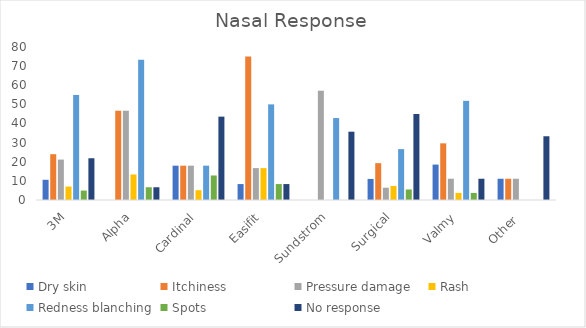
| Category | Dry skin | Itchiness | Pressure damage | Rash  | Redness blanching | Spots | No response |
|---|---|---|---|---|---|---|---|
| 3M | 10.563 | 23.944 | 21.127 | 7.042 | 54.93 | 4.93 | 21.831 |
| Alpha | 0 | 46.667 | 46.667 | 13.333 | 73.333 | 6.667 | 6.667 |
| Cardinal | 17.949 | 17.949 | 17.949 | 5.128 | 17.949 | 12.821 | 43.59 |
| Easifit | 8.333 | 75 | 16.667 | 16.667 | 50 | 8.333 | 8.333 |
| Sundstrom | 0 | 0 | 57.143 | 0 | 42.857 | 0 | 35.714 |
| Surgical | 11.009 | 19.266 | 6.422 | 7.339 | 26.606 | 5.505 | 44.954 |
| Valmy | 18.519 | 29.63 | 11.111 | 3.704 | 51.852 | 3.704 | 11.111 |
| Other  | 11.111 | 11.111 | 11.111 | 0 | 0 | 0 | 33.333 |